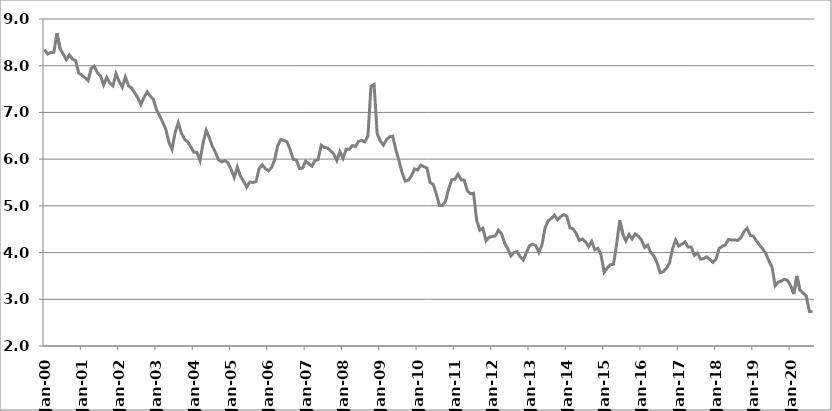
| Category | Series 1 |
|---|---|
| 2000-01-01 | 8.35 |
| 2000-02-01 | 8.25 |
| 2000-03-01 | 8.28 |
| 2000-04-01 | 8.29 |
| 2000-05-01 | 8.7 |
| 2000-06-01 | 8.36 |
| 2000-07-01 | 8.25 |
| 2000-08-01 | 8.13 |
| 2000-09-01 | 8.23 |
| 2000-10-01 | 8.14 |
| 2000-11-01 | 8.11 |
| 2000-12-01 | 7.84 |
| 2001-01-01 | 7.8 |
| 2001-02-01 | 7.74 |
| 2001-03-01 | 7.68 |
| 2001-04-01 | 7.94 |
| 2001-05-01 | 7.99 |
| 2001-06-01 | 7.85 |
| 2001-07-01 | 7.78 |
| 2001-08-01 | 7.59 |
| 2001-09-01 | 7.75 |
| 2001-10-01 | 7.63 |
| 2001-11-01 | 7.57 |
| 2001-12-01 | 7.83 |
| 2002-01-01 | 7.66 |
| 2002-02-01 | 7.54 |
| 2002-03-01 | 7.76 |
| 2002-04-01 | 7.57 |
| 2002-05-01 | 7.52 |
| 2002-06-01 | 7.42 |
| 2002-07-01 | 7.31 |
| 2002-08-01 | 7.17 |
| 2002-09-01 | 7.32 |
| 2002-10-01 | 7.44 |
| 2002-11-01 | 7.35 |
| 2002-12-01 | 7.28 |
| 2003-01-01 | 7.06 |
| 2003-02-01 | 6.93 |
| 2003-03-01 | 6.79 |
| 2003-04-01 | 6.64 |
| 2003-05-01 | 6.36 |
| 2003-06-01 | 6.21 |
| 2003-07-01 | 6.57 |
| 2003-08-01 | 6.78 |
| 2003-09-01 | 6.56 |
| 2003-10-01 | 6.43 |
| 2003-11-01 | 6.37 |
| 2003-12-01 | 6.27 |
| 2004-01-01 | 6.15 |
| 2004-02-01 | 6.15 |
| 2004-03-01 | 5.97 |
| 2004-04-01 | 6.35 |
| 2004-05-01 | 6.62 |
| 2004-06-01 | 6.46 |
| 2004-07-01 | 6.27 |
| 2004-08-01 | 6.14 |
| 2004-09-01 | 5.98 |
| 2004-10-01 | 5.94 |
| 2004-11-01 | 5.97 |
| 2004-12-01 | 5.92 |
| 2005-01-01 | 5.78 |
| 2005-02-01 | 5.61 |
| 2005-03-01 | 5.83 |
| 2005-04-01 | 5.64 |
| 2005-05-01 | 5.53 |
| 2005-06-01 | 5.4 |
| 2005-07-01 | 5.51 |
| 2005-08-01 | 5.5 |
| 2005-09-01 | 5.52 |
| 2005-10-01 | 5.79 |
| 2005-11-01 | 5.88 |
| 2005-12-01 | 5.8 |
| 2006-01-01 | 5.75 |
| 2006-02-01 | 5.82 |
| 2006-03-01 | 5.98 |
| 2006-04-01 | 6.29 |
| 2006-05-01 | 6.42 |
| 2006-06-01 | 6.4 |
| 2006-07-01 | 6.37 |
| 2006-08-01 | 6.2 |
| 2006-09-01 | 6 |
| 2006-10-01 | 5.98 |
| 2006-11-01 | 5.8 |
| 2006-12-01 | 5.81 |
| 2007-01-01 | 5.96 |
| 2007-02-01 | 5.9 |
| 2007-03-01 | 5.85 |
| 2007-04-01 | 5.97 |
| 2007-05-01 | 5.99 |
| 2007-06-01 | 6.3 |
| 2007-07-01 | 6.25 |
| 2007-08-01 | 6.24 |
| 2007-09-01 | 6.18 |
| 2007-10-01 | 6.11 |
| 2007-11-01 | 5.97 |
| 2007-12-01 | 6.16 |
| 2008-01-01 | 6.02 |
| 2008-02-01 | 6.21 |
| 2008-03-01 | 6.21 |
| 2008-04-01 | 6.29 |
| 2008-05-01 | 6.27 |
| 2008-06-01 | 6.38 |
| 2008-07-01 | 6.4 |
| 2008-08-01 | 6.37 |
| 2008-09-01 | 6.49 |
| 2008-10-01 | 7.56 |
| 2008-11-01 | 7.6 |
| 2008-12-01 | 6.54 |
| 2009-01-01 | 6.39 |
| 2009-02-01 | 6.3 |
| 2009-03-01 | 6.42 |
| 2009-04-01 | 6.48 |
| 2009-05-01 | 6.49 |
| 2009-06-01 | 6.2 |
| 2009-07-01 | 5.97 |
| 2009-08-01 | 5.71 |
| 2009-09-01 | 5.53 |
| 2009-10-01 | 5.55 |
| 2009-11-01 | 5.64 |
| 2009-12-01 | 5.79 |
| 2010-01-01 | 5.77 |
| 2010-02-01 | 5.87 |
| 2010-03-01 | 5.84 |
| 2010-04-01 | 5.81 |
| 2010-05-01 | 5.5 |
| 2010-06-01 | 5.46 |
| 2010-07-01 | 5.26 |
| 2010-08-01 | 5.01 |
| 2010-09-01 | 5.01 |
| 2010-10-01 | 5.1 |
| 2010-11-01 | 5.37 |
| 2010-12-01 | 5.56 |
| 2011-01-01 | 5.57 |
| 2011-02-01 | 5.68 |
| 2011-03-01 | 5.56 |
| 2011-04-01 | 5.55 |
| 2011-05-01 | 5.32 |
| 2011-06-01 | 5.26 |
| 2011-07-01 | 5.27 |
| 2011-08-01 | 4.69 |
| 2011-09-01 | 4.48 |
| 2011-10-01 | 4.52 |
| 2011-11-01 | 4.25 |
| 2011-12-01 | 4.33 |
| 2012-01-01 | 4.34 |
| 2012-02-01 | 4.36 |
| 2012-03-01 | 4.48 |
| 2012-04-01 | 4.4 |
| 2012-05-01 | 4.2 |
| 2012-06-01 | 4.08 |
| 2012-07-01 | 3.93 |
| 2012-08-01 | 4 |
| 2012-09-01 | 4.02 |
| 2012-10-01 | 3.91 |
| 2012-11-01 | 3.84 |
| 2012-12-01 | 4 |
| 2013-01-01 | 4.15 |
| 2013-02-01 | 4.18 |
| 2013-03-01 | 4.15 |
| 2013-04-01 | 4 |
| 2013-05-01 | 4.17 |
| 2013-06-01 | 4.53 |
| 2013-07-01 | 4.68 |
| 2013-08-01 | 4.73 |
| 2013-09-01 | 4.8 |
| 2013-10-01 | 4.7 |
| 2013-11-01 | 4.77 |
| 2013-12-01 | 4.81 |
| 2014-01-01 | 4.778 |
| 2014-02-01 | 4.53 |
| 2014-03-01 | 4.51 |
| 2014-04-01 | 4.41 |
| 2014-05-01 | 4.26 |
| 2014-06-01 | 4.29 |
| 2014-07-01 | 4.23 |
| 2014-08-01 | 4.13 |
| 2014-09-01 | 4.24 |
| 2014-10-01 | 4.06 |
| 2014-11-01 | 4.09 |
| 2014-12-01 | 3.95 |
| 2015-01-01 | 3.58 |
| 2015-02-01 | 3.67 |
| 2015-03-01 | 3.74 |
| 2015-04-01 | 3.75 |
| 2015-05-01 | 4.17 |
| 2015-06-01 | 4.69 |
| 2015-07-01 | 4.4 |
| 2015-08-01 | 4.25 |
| 2015-09-01 | 4.39 |
| 2015-10-01 | 4.29 |
| 2015-11-01 | 4.4 |
| 2015-12-01 | 4.35 |
| 2016-01-01 | 4.27 |
| 2016-02-01 | 4.11 |
| 2016-03-01 | 4.16 |
| 2016-04-01 | 4 |
| 2016-05-01 | 3.93 |
| 2016-06-01 | 3.78 |
| 2016-07-01 | 3.57 |
| 2016-08-01 | 3.59 |
| 2016-09-01 | 3.66 |
| 2016-10-01 | 3.77 |
| 2016-11-01 | 4.08 |
| 2016-12-01 | 4.27 |
| 2017-01-01 | 4.14 |
| 2017-02-01 | 4.18 |
| 2017-03-01 | 4.23 |
| 2017-04-01 | 4.12 |
| 2017-05-01 | 4.12 |
| 2017-06-01 | 3.94 |
| 2017-07-01 | 3.99 |
| 2017-08-01 | 3.86 |
| 2017-09-01 | 3.87 |
| 2017-10-01 | 3.91 |
| 2017-11-01 | 3.85 |
| 2017-12-01 | 3.79 |
| 2018-01-01 | 3.86 |
| 2018-02-01 | 4.09 |
| 2018-03-01 | 4.13 |
| 2018-04-01 | 4.17 |
| 2018-05-01 | 4.28 |
| 2018-06-01 | 4.27 |
| 2018-07-01 | 4.27 |
| 2018-08-01 | 4.26 |
| 2018-09-01 | 4.32 |
| 2018-10-01 | 4.45 |
| 2018-11-01 | 4.52 |
| 2018-12-01 | 4.37 |
| 2019-01-01 | 4.35 |
| 2019-02-01 | 4.25 |
| 2019-03-01 | 4.16 |
| 2019-04-01 | 4.08 |
| 2019-05-01 | 3.98 |
| 2019-06-01 | 3.82 |
| 2019-07-01 | 3.69 |
| 2019-08-01 | 3.29 |
| 2019-09-01 | 3.37 |
| 2019-10-01 | 3.39 |
| 2019-11-01 | 3.43 |
| 2019-12-01 | 3.4 |
| 2020-01-01 | 3.29 |
| 2020-02-01 | 3.11 |
| 2020-03-01 | 3.5 |
| 2020-04-01 | 3.19 |
| 2020-05-01 | 3.14 |
| 2020-06-01 | 3.07 |
| 2020-07-01 | 2.74 |
| 2020-08-01 | 2.73 |